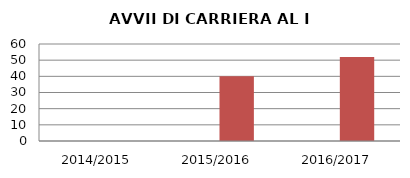
| Category | ANNO | NUMERO |
|---|---|---|
| 2014/2015 | 0 | 0 |
| 2015/2016 | 0 | 40 |
| 2016/2017 | 0 | 52 |